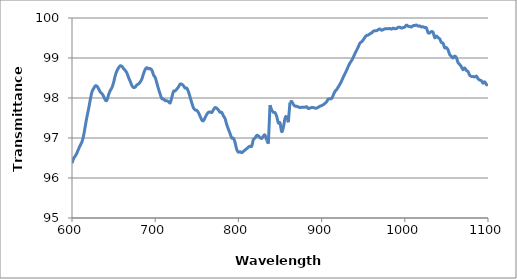
| Category | Series 0 |
|---|---|
| 1100.0 | 98.317 |
| 1098.0 | 98.34 |
| 1096.0 | 98.405 |
| 1094.0 | 98.372 |
| 1092.0 | 98.433 |
| 1090.0 | 98.45 |
| 1088.0 | 98.482 |
| 1086.0 | 98.547 |
| 1084.0 | 98.527 |
| 1082.0 | 98.537 |
| 1080.0 | 98.54 |
| 1078.0 | 98.568 |
| 1076.0 | 98.661 |
| 1074.0 | 98.688 |
| 1072.0 | 98.751 |
| 1070.0 | 98.706 |
| 1068.0 | 98.78 |
| 1066.0 | 98.837 |
| 1064.0 | 98.883 |
| 1062.0 | 99.009 |
| 1060.0 | 99.048 |
| 1058.0 | 98.999 |
| 1056.0 | 99.041 |
| 1054.0 | 99.086 |
| 1052.0 | 99.204 |
| 1050.0 | 99.26 |
| 1048.0 | 99.254 |
| 1046.0 | 99.369 |
| 1044.0 | 99.386 |
| 1042.0 | 99.477 |
| 1040.0 | 99.508 |
| 1038.0 | 99.549 |
| 1036.0 | 99.506 |
| 1034.0 | 99.643 |
| 1032.0 | 99.661 |
| 1030.0 | 99.628 |
| 1028.0 | 99.631 |
| 1026.0 | 99.752 |
| 1024.0 | 99.759 |
| 1022.0 | 99.781 |
| 1020.0 | 99.777 |
| 1018.0 | 99.802 |
| 1016.0 | 99.796 |
| 1014.0 | 99.824 |
| 1012.0 | 99.812 |
| 1010.0 | 99.808 |
| 1008.0 | 99.775 |
| 1006.0 | 99.786 |
| 1004.0 | 99.795 |
| 1002.0 | 99.823 |
| 1000.0 | 99.774 |
| 998.0 | 99.761 |
| 996.0 | 99.747 |
| 994.0 | 99.77 |
| 992.0 | 99.767 |
| 990.0 | 99.736 |
| 988.0 | 99.734 |
| 986.0 | 99.747 |
| 984.0 | 99.721 |
| 982.0 | 99.738 |
| 980.0 | 99.733 |
| 978.0 | 99.734 |
| 976.0 | 99.731 |
| 974.0 | 99.71 |
| 972.0 | 99.695 |
| 970.0 | 99.727 |
| 968.0 | 99.707 |
| 966.0 | 99.684 |
| 964.0 | 99.68 |
| 962.0 | 99.668 |
| 960.0 | 99.624 |
| 958.0 | 99.603 |
| 956.0 | 99.574 |
| 954.0 | 99.563 |
| 952.0 | 99.514 |
| 950.0 | 99.452 |
| 948.0 | 99.403 |
| 946.0 | 99.369 |
| 944.0 | 99.274 |
| 942.0 | 99.189 |
| 940.0 | 99.107 |
| 938.0 | 99.014 |
| 936.0 | 98.934 |
| 934.0 | 98.871 |
| 932.0 | 98.787 |
| 930.0 | 98.69 |
| 928.0 | 98.607 |
| 926.0 | 98.52 |
| 924.0 | 98.425 |
| 922.0 | 98.345 |
| 920.0 | 98.275 |
| 918.0 | 98.208 |
| 916.0 | 98.161 |
| 914.0 | 98.07 |
| 912.0 | 97.987 |
| 910.0 | 97.978 |
| 908.0 | 97.973 |
| 906.0 | 97.906 |
| 904.0 | 97.866 |
| 902.0 | 97.832 |
| 900.0 | 97.808 |
| 898.0 | 97.796 |
| 896.0 | 97.768 |
| 894.0 | 97.748 |
| 892.0 | 97.747 |
| 890.0 | 97.763 |
| 888.0 | 97.762 |
| 886.0 | 97.748 |
| 884.0 | 97.737 |
| 882.0 | 97.783 |
| 880.0 | 97.768 |
| 878.0 | 97.766 |
| 876.0 | 97.771 |
| 874.0 | 97.761 |
| 872.0 | 97.776 |
| 870.0 | 97.793 |
| 868.0 | 97.798 |
| 866.0 | 97.841 |
| 864.0 | 97.914 |
| 862.0 | 97.894 |
| 860.0 | 97.393 |
| 858.0 | 97.561 |
| 856.0 | 97.49 |
| 854.0 | 97.263 |
| 852.0 | 97.161 |
| 850.0 | 97.377 |
| 848.0 | 97.377 |
| 846.0 | 97.542 |
| 844.0 | 97.633 |
| 842.0 | 97.644 |
| 840.0 | 97.702 |
| 838.0 | 97.822 |
| 836.0 | 96.857 |
| 834.0 | 96.941 |
| 832.0 | 97.073 |
| 830.0 | 97.049 |
| 828.0 | 96.988 |
| 826.0 | 97.008 |
| 824.0 | 97.054 |
| 822.0 | 97.065 |
| 820.0 | 96.998 |
| 818.0 | 96.962 |
| 816.0 | 96.793 |
| 814.0 | 96.796 |
| 812.0 | 96.771 |
| 810.0 | 96.733 |
| 808.0 | 96.701 |
| 806.0 | 96.665 |
| 804.0 | 96.632 |
| 802.0 | 96.657 |
| 800.0 | 96.647 |
| 798.0 | 96.711 |
| 796.0 | 96.888 |
| 794.0 | 96.993 |
| 792.0 | 97 |
| 790.0 | 97.111 |
| 788.0 | 97.22 |
| 786.0 | 97.332 |
| 784.0 | 97.485 |
| 782.0 | 97.552 |
| 780.0 | 97.64 |
| 778.0 | 97.642 |
| 776.0 | 97.699 |
| 774.0 | 97.745 |
| 772.0 | 97.76 |
| 770.0 | 97.707 |
| 768.0 | 97.637 |
| 766.0 | 97.651 |
| 764.0 | 97.642 |
| 762.0 | 97.593 |
| 760.0 | 97.512 |
| 758.0 | 97.431 |
| 756.0 | 97.451 |
| 754.0 | 97.543 |
| 752.0 | 97.634 |
| 750.0 | 97.69 |
| 748.0 | 97.701 |
| 746.0 | 97.753 |
| 744.0 | 97.876 |
| 742.0 | 98.018 |
| 740.0 | 98.152 |
| 738.0 | 98.247 |
| 736.0 | 98.248 |
| 734.0 | 98.305 |
| 732.0 | 98.342 |
| 730.0 | 98.348 |
| 728.0 | 98.278 |
| 726.0 | 98.224 |
| 724.0 | 98.178 |
| 722.0 | 98.165 |
| 720.0 | 98.017 |
| 718.0 | 97.88 |
| 716.0 | 97.907 |
| 714.0 | 97.933 |
| 712.0 | 97.934 |
| 710.0 | 97.975 |
| 708.0 | 97.984 |
| 706.0 | 98.096 |
| 704.0 | 98.224 |
| 702.0 | 98.371 |
| 700.0 | 98.511 |
| 698.0 | 98.575 |
| 696.0 | 98.694 |
| 694.0 | 98.735 |
| 692.0 | 98.729 |
| 690.0 | 98.758 |
| 688.0 | 98.715 |
| 686.0 | 98.608 |
| 684.0 | 98.477 |
| 682.0 | 98.399 |
| 680.0 | 98.351 |
| 678.0 | 98.328 |
| 676.0 | 98.273 |
| 674.0 | 98.262 |
| 672.0 | 98.31 |
| 670.0 | 98.414 |
| 668.0 | 98.512 |
| 666.0 | 98.624 |
| 664.0 | 98.688 |
| 662.0 | 98.735 |
| 660.0 | 98.792 |
| 658.0 | 98.805 |
| 656.0 | 98.755 |
| 654.0 | 98.679 |
| 652.0 | 98.561 |
| 650.0 | 98.386 |
| 648.0 | 98.259 |
| 646.0 | 98.188 |
| 644.0 | 98.085 |
| 642.0 | 97.944 |
| 640.0 | 97.951 |
| 638.0 | 98.043 |
| 636.0 | 98.11 |
| 634.0 | 98.15 |
| 632.0 | 98.228 |
| 630.0 | 98.295 |
| 628.0 | 98.302 |
| 626.0 | 98.237 |
| 624.0 | 98.152 |
| 622.0 | 97.96 |
| 620.0 | 97.734 |
| 618.0 | 97.535 |
| 616.0 | 97.306 |
| 614.0 | 97.064 |
| 612.0 | 96.905 |
| 610.0 | 96.821 |
| 608.0 | 96.73 |
| 606.0 | 96.629 |
| 604.0 | 96.552 |
| 602.0 | 96.49 |
| 600.0 | 96.369 |